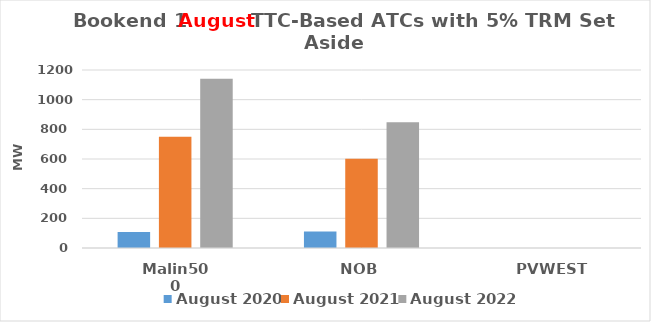
| Category | August 2020 | August 2021 | August 2022 |
|---|---|---|---|
| Malin500 | 107.25 | 750 | 1141.8 |
| NOB | 111.46 | 602.2 | 847.9 |
| PVWEST | 0 | 0 | 0 |